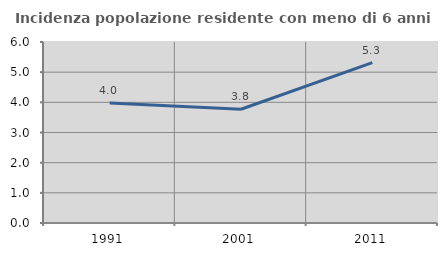
| Category | Incidenza popolazione residente con meno di 6 anni |
|---|---|
| 1991.0 | 3.974 |
| 2001.0 | 3.771 |
| 2011.0 | 5.315 |